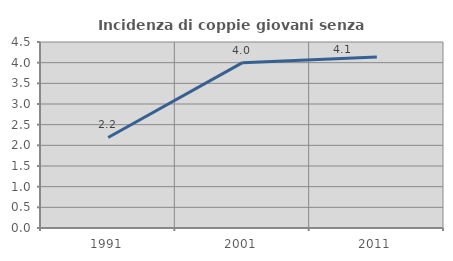
| Category | Incidenza di coppie giovani senza figli |
|---|---|
| 1991.0 | 2.19 |
| 2001.0 | 4 |
| 2011.0 | 4.138 |